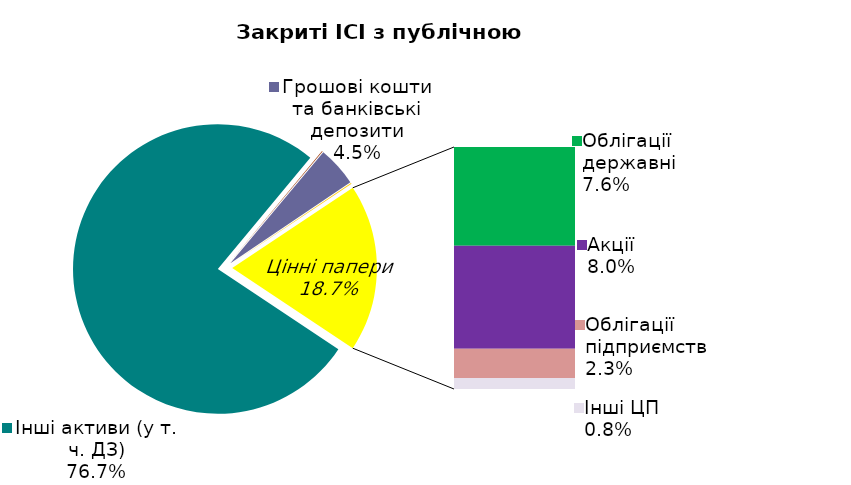
| Category | Series 0 |
|---|---|
| Інші активи (у т. ч. ДЗ) | 0.767 |
| Нерухомість | 0.001 |
| Грошові кошти та банківські депозити | 0.045 |
| Банківські метали | 0.001 |
| Облігації державні  | 0.076 |
| Акції | 0.08 |
| Облігації підприємств | 0.023 |
| Інші ЦП | 0.008 |